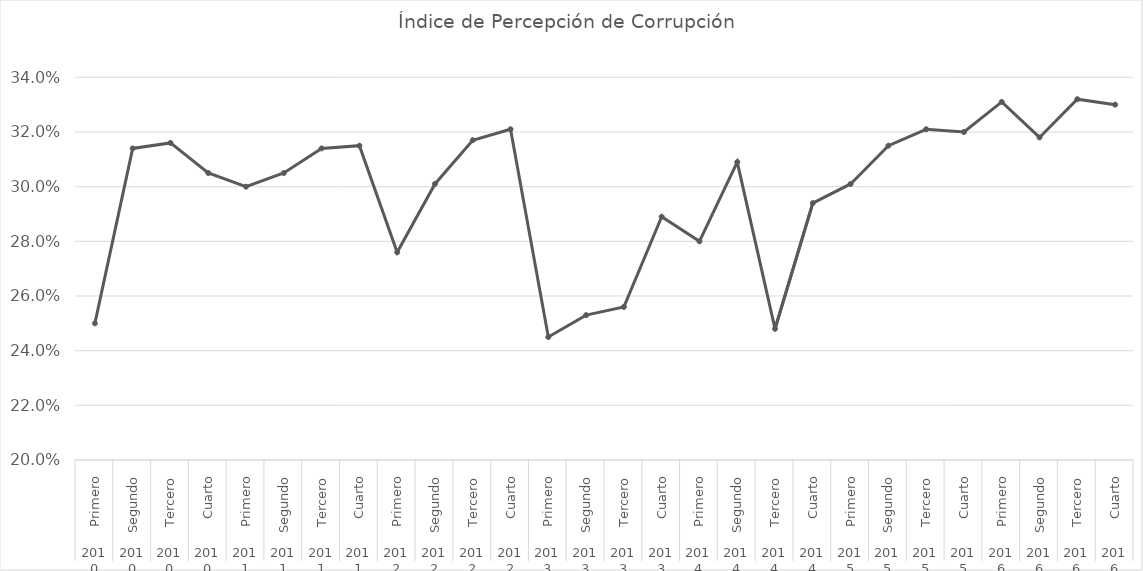
| Category | Indicador |
|---|---|
| 0 | 0.25 |
| 1 | 0.314 |
| 2 | 0.316 |
| 3 | 0.305 |
| 4 | 0.3 |
| 5 | 0.305 |
| 6 | 0.314 |
| 7 | 0.315 |
| 8 | 0.276 |
| 9 | 0.301 |
| 10 | 0.317 |
| 11 | 0.321 |
| 12 | 0.245 |
| 13 | 0.253 |
| 14 | 0.256 |
| 15 | 0.289 |
| 16 | 0.28 |
| 17 | 0.309 |
| 18 | 0.248 |
| 19 | 0.294 |
| 20 | 0.301 |
| 21 | 0.315 |
| 22 | 0.321 |
| 23 | 0.32 |
| 24 | 0.331 |
| 25 | 0.318 |
| 26 | 0.332 |
| 27 | 0.33 |